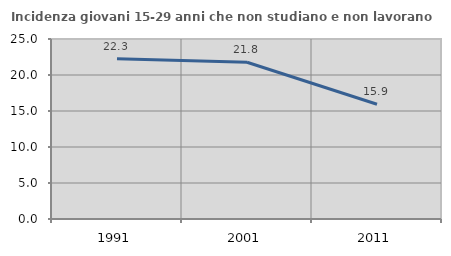
| Category | Incidenza giovani 15-29 anni che non studiano e non lavorano  |
|---|---|
| 1991.0 | 22.267 |
| 2001.0 | 21.767 |
| 2011.0 | 15.934 |